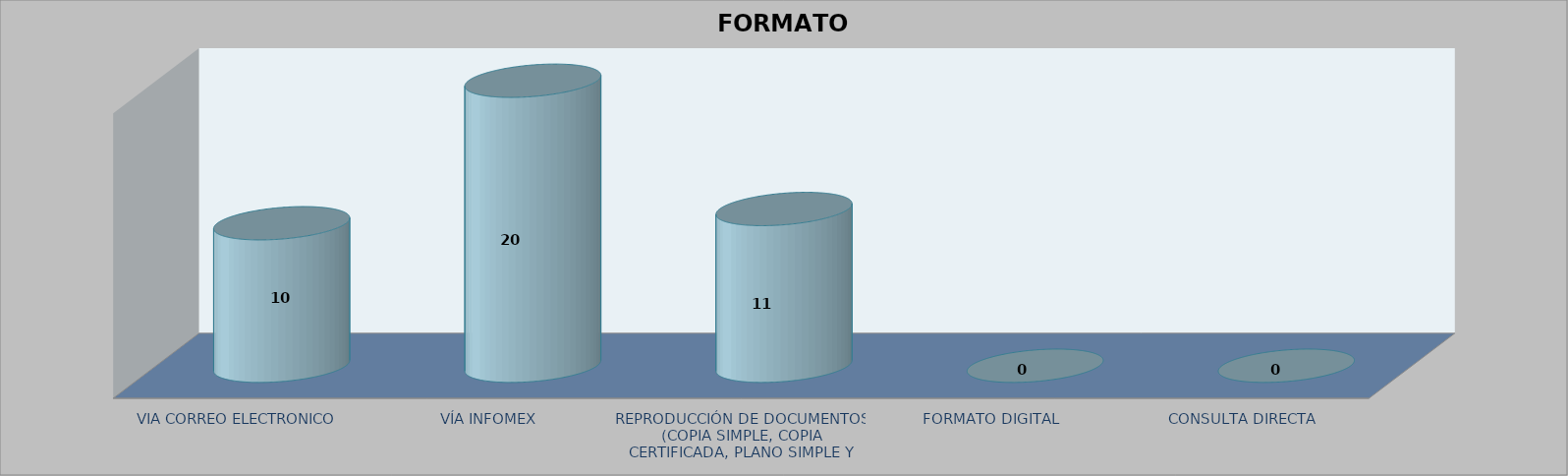
| Category |        FORMATO SOLICITADO | Series 1 | Series 2 |
|---|---|---|---|
| VIA CORREO ELECTRONICO |  |  | 10 |
| VÍA INFOMEX |  |  | 20 |
| REPRODUCCIÓN DE DOCUMENTOS (COPIA SIMPLE, COPIA CERTIFICADA, PLANO SIMPLE Y PLANO CERTIFICADO) |  |  | 11 |
| FORMATO DIGITAL |  |  | 0 |
| CONSULTA DIRECTA |  |  | 0 |